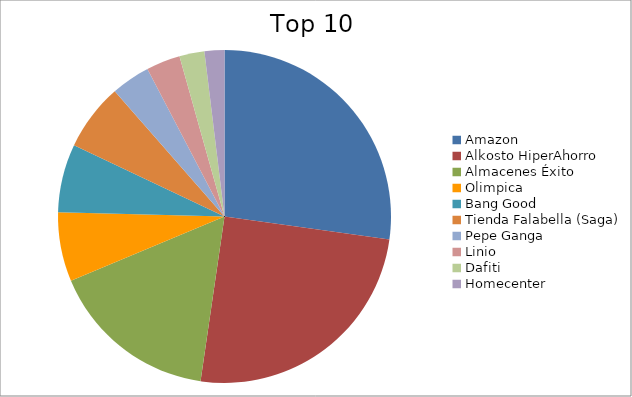
| Category | Series 0 |
|---|---|
| Amazon | 27.2 |
| Alkosto HiperAhorro | 25.1 |
| Almacenes Éxito | 16.39 |
| Olimpica | 6.71 |
| Bang Good | 6.64 |
| Tienda Falabella (Saga) | 6.51 |
| Pepe Ganga | 3.79 |
| Linio | 3.3 |
| Dafiti | 2.43 |
| Homecenter | 1.93 |